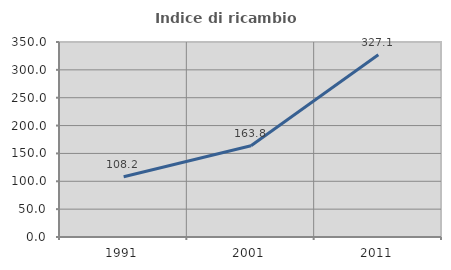
| Category | Indice di ricambio occupazionale  |
|---|---|
| 1991.0 | 108.229 |
| 2001.0 | 163.844 |
| 2011.0 | 327.064 |